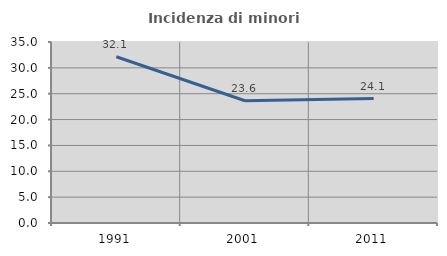
| Category | Incidenza di minori stranieri |
|---|---|
| 1991.0 | 32.143 |
| 2001.0 | 23.636 |
| 2011.0 | 24.064 |